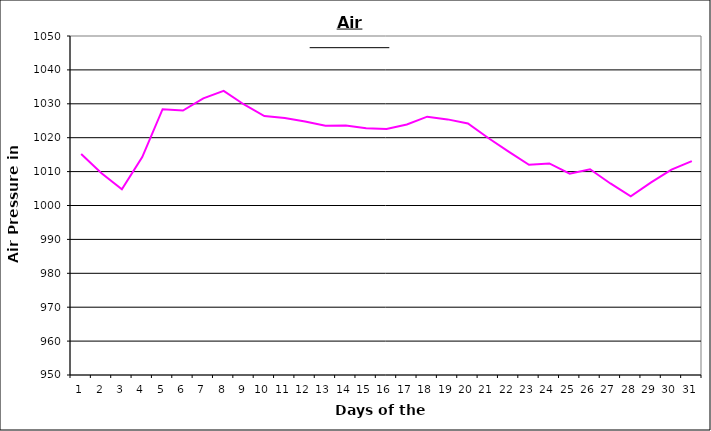
| Category | Series 0 |
|---|---|
| 0 | 1015.2 |
| 1 | 1009.5 |
| 2 | 1004.8 |
| 3 | 1014.3 |
| 4 | 1028.4 |
| 5 | 1028 |
| 6 | 1031.6 |
| 7 | 1033.8 |
| 8 | 1029.8 |
| 9 | 1026.4 |
| 10 | 1025.8 |
| 11 | 1024.8 |
| 12 | 1023.5 |
| 13 | 1023.6 |
| 14 | 1022.8 |
| 15 | 1022.6 |
| 16 | 1023.9 |
| 17 | 1026.2 |
| 18 | 1025.4 |
| 19 | 1024.2 |
| 20 | 1019.9 |
| 21 | 1015.9 |
| 22 | 1012 |
| 23 | 1012.4 |
| 24 | 1009.4 |
| 25 | 1010.7 |
| 26 | 1006.5 |
| 27 | 1002.7 |
| 28 | 1006.8 |
| 29 | 1010.6 |
| 30 | 1013.1 |